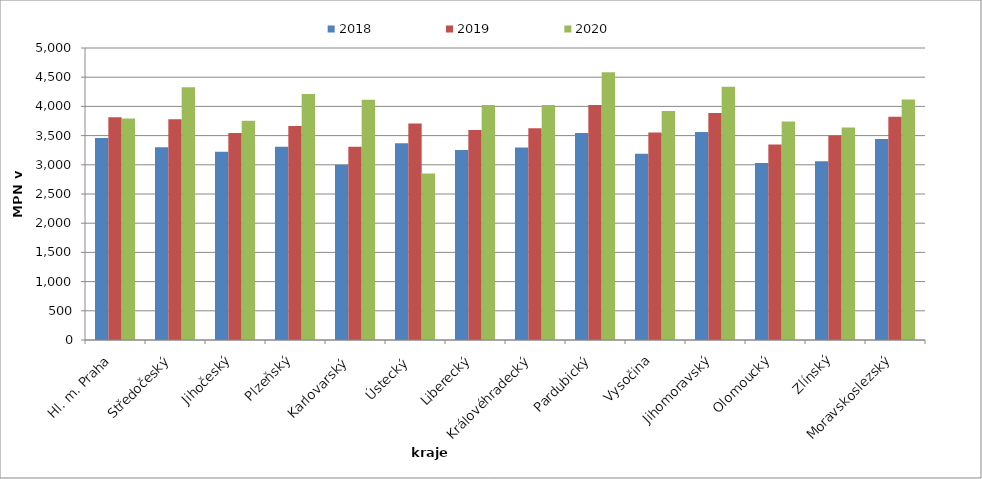
| Category | 2018 | 2019 | 2020 |
|---|---|---|---|
| Hl. m. Praha | 3461 | 3815 | 3793 |
| Středočeský | 3301 | 3778 | 4328 |
| Jihočeský | 3223 | 3545 | 3753 |
| Plzeňský | 3310 | 3663 | 4214 |
| Karlovarský  | 3002 | 3311 | 4112 |
| Ústecký   | 3371 | 3708 | 2853 |
| Liberecký | 3252 | 3597 | 4022 |
| Královéhradecký | 3296 | 3626 | 4024 |
| Pardubický | 3543 | 4023 | 4586 |
| Vysočina | 3189 | 3555 | 3923 |
| Jihomoravský | 3561 | 3889 | 4337 |
| Olomoucký | 3029 | 3347 | 3742 |
| Zlínský | 3060 | 3502 | 3638 |
| Moravskoslezský | 3443 | 3822 | 4118 |